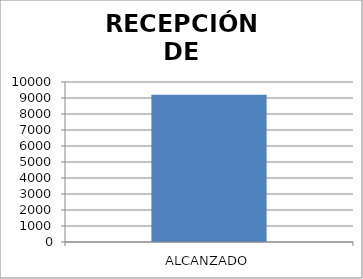
| Category | FOLIO |
|---|---|
| ALCANZADO | 9205 |